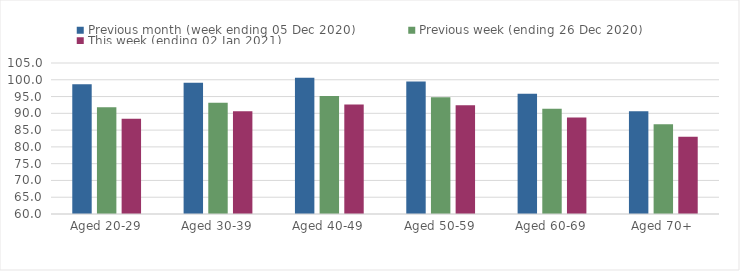
| Category | Previous month (week ending 05 Dec 2020) | Previous week (ending 26 Dec 2020) | This week (ending 02 Jan 2021) |
|---|---|---|---|
| Aged 20-29 | 98.69 | 91.78 | 88.41 |
| Aged 30-39 | 99.15 | 93.14 | 90.62 |
| Aged 40-49 | 100.57 | 95.14 | 92.61 |
| Aged 50-59 | 99.46 | 94.83 | 92.44 |
| Aged 60-69 | 95.84 | 91.37 | 88.75 |
| Aged 70+ | 90.59 | 86.74 | 83 |